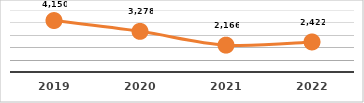
| Category | SERVICIOS TECNOLÓGICOS PROPORCIONADOS
PRIMER TRIMESTRE, EJERCICIO 2022 |
|---|---|
| 2019.0 | 4150 |
| 2020.0 | 3278 |
| 2021.0 | 2166 |
| 2022.0 | 2422 |